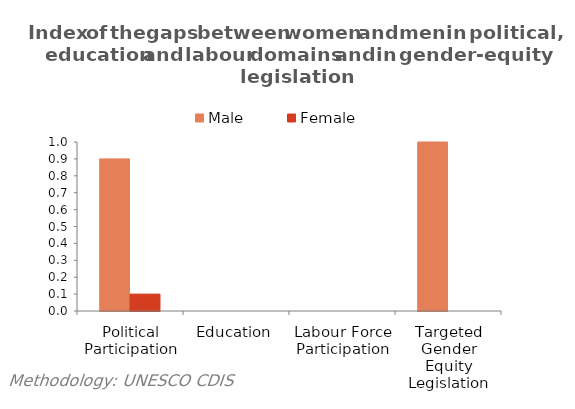
| Category | Male | Female |
|---|---|---|
| Political Participation | 0.9 | 0.1 |
| Education | 0 | 0 |
| Labour Force Participation | 0 | 0 |
| Targeted Gender Equity Legislation | 1 | 0 |